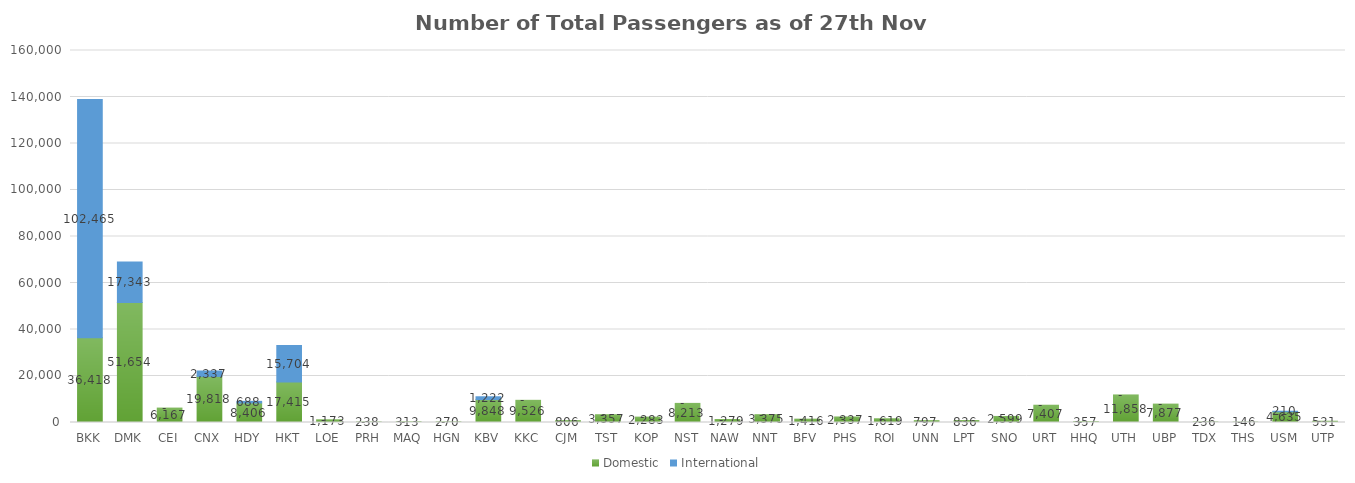
| Category | Domestic | International |
|---|---|---|
| BKK | 36418 | 102465 |
| DMK | 51654 | 17343 |
| CEI | 6167 | 0 |
| CNX | 19818 | 2337 |
| HDY | 8406 | 688 |
| HKT | 17415 | 15704 |
| LOE | 1173 | 0 |
| PRH | 238 | 0 |
| MAQ | 313 | 0 |
| HGN | 270 | 0 |
| KBV | 9848 | 1222 |
| KKC | 9526 | 0 |
| CJM | 806 | 0 |
| TST | 3357 | 0 |
| KOP | 2283 | 0 |
| NST | 8213 | 0 |
| NAW | 1279 | 0 |
| NNT | 3375 | 0 |
| BFV | 1416 | 0 |
| PHS | 2337 | 0 |
| ROI | 1619 | 0 |
| UNN | 797 | 0 |
| LPT | 836 | 0 |
| SNO | 2599 | 0 |
| URT | 7407 | 0 |
| HHQ | 357 | 0 |
| UTH | 11858 | 0 |
| UBP | 7877 | 0 |
| TDX | 236 | 0 |
| THS | 146 | 0 |
| USM | 4635 | 210 |
| UTP | 531 | 0 |